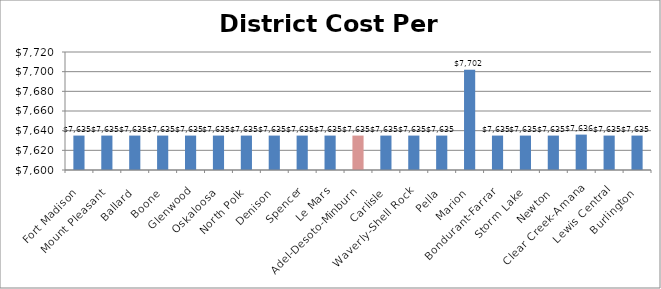
| Category | DCPP |
|---|---|
| Fort Madison | 7635 |
| Mount Pleasant | 7635 |
| Ballard | 7635 |
| Boone | 7635 |
| Glenwood | 7635 |
| Oskaloosa | 7635 |
| North Polk | 7635 |
| Denison | 7635 |
| Spencer | 7635 |
| Le Mars | 7635 |
| Adel-Desoto-Minburn | 7635 |
| Carlisle | 7635 |
| Waverly-Shell Rock | 7635 |
| Pella | 7635 |
| Marion | 7702 |
| Bondurant-Farrar | 7635 |
| Storm Lake | 7635 |
| Newton | 7635 |
| Clear Creek-Amana | 7636 |
| Lewis Central | 7635 |
| Burlington | 7635 |